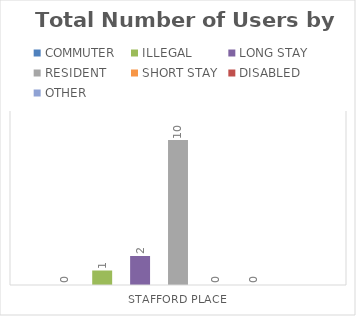
| Category | COMMUTER | ILLEGAL | LONG STAY | RESIDENT | SHORT STAY | DISABLED | OTHER |
|---|---|---|---|---|---|---|---|
| STAFFORD PLACE | 0 | 1 | 2 | 10 | 0 | 0 | 0 |